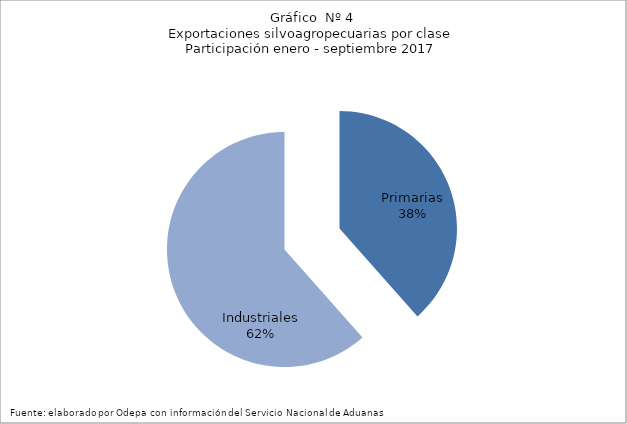
| Category | Series 0 |
|---|---|
| Primarias | 4697192 |
| Industriales | 7519672 |